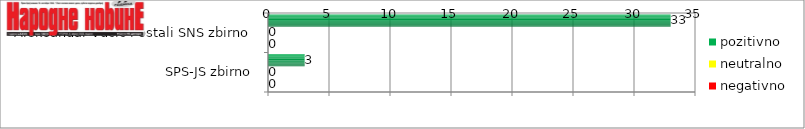
| Category | pozitivno | neutralno | negativno |
|---|---|---|---|
| Aleksandar Vučić i ostali SNS zbirno | 33 | 0 | 0 |
| SPS-JS zbirno | 3 | 0 | 0 |